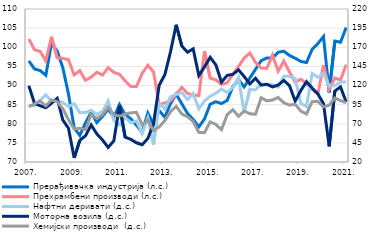
| Category | Прерађивачка индустрија (л.с.) | Прехрамбени производи (л.с.) |
|---|---|---|
| 2007. | 96.427 | 102.153 |
| II | 94.327 | 99.364 |
| III | 93.9 | 98.904 |
| IV | 92.682 | 96.417 |
| 2008. | 100.969 | 102.741 |
| II | 99.031 | 97.259 |
| III | 94.635 | 97.109 |
| IV | 87.766 | 96.715 |
| 2009. | 78.923 | 92.764 |
| II | 76.927 | 93.876 |
| III | 80.273 | 91.367 |
| IV | 82.995 | 92.186 |
| 2010. | 80.321 | 93.462 |
| II | 81.929 | 92.737 |
| III | 83.822 | 94.65 |
| IV | 81.702 | 93.434 |
| 2011. | 85.031 | 92.939 |
| II | 82.353 | 91.191 |
| III | 81.307 | 89.747 |
| IV | 79.595 | 89.752 |
| 2012. | 77.737 | 93.154 |
| II | 82.81 | 95.294 |
| III | 79.836 | 93.556 |
| IV | 83.455 | 84.956 |
| 2013. | 81.697 | 85.466 |
| II | 85.208 | 85.966 |
| III | 87.729 | 87.693 |
| IV | 85.199 | 89.509 |
| 2014. | 82.71 | 87.919 |
| II | 81.127 | 87.555 |
| III | 79.166 | 87.381 |
| IV | 81.263 | 98.993 |
| 2015. | 85.102 | 91.914 |
| II | 85.756 | 91.502 |
| III | 85.287 | 90.314 |
| IV | 86.087 | 90.709 |
| 2016. | 89.694 | 92.906 |
| II | 91.518 | 94.986 |
| III | 89.623 | 97.172 |
| IV | 91.945 | 98.494 |
| 2017. | 94.228 | 96.032 |
| II | 96.483 | 94.548 |
| III | 97.201 | 94.479 |
| IV | 97.131 | 97.956 |
| 2018. | 98.696 | 93.722 |
| II | 98.953 | 96.403 |
| III | 97.861 | 93.539 |
| IV | 97.135 | 90.876 |
| 2019. | 96.293 | 91.63 |
| II | 95.999 | 90.541 |
| III | 99.472 | 89.031 |
| IV | 100.947 | 87.728 |
| 2020. | 102.797 | 95.288 |
| II | 88.178 | 88.984 |
| III | 101.606 | 91.978 |
| IV | 101.309 | 91.42 |
| 2021. | 105.153 | 95.422 |